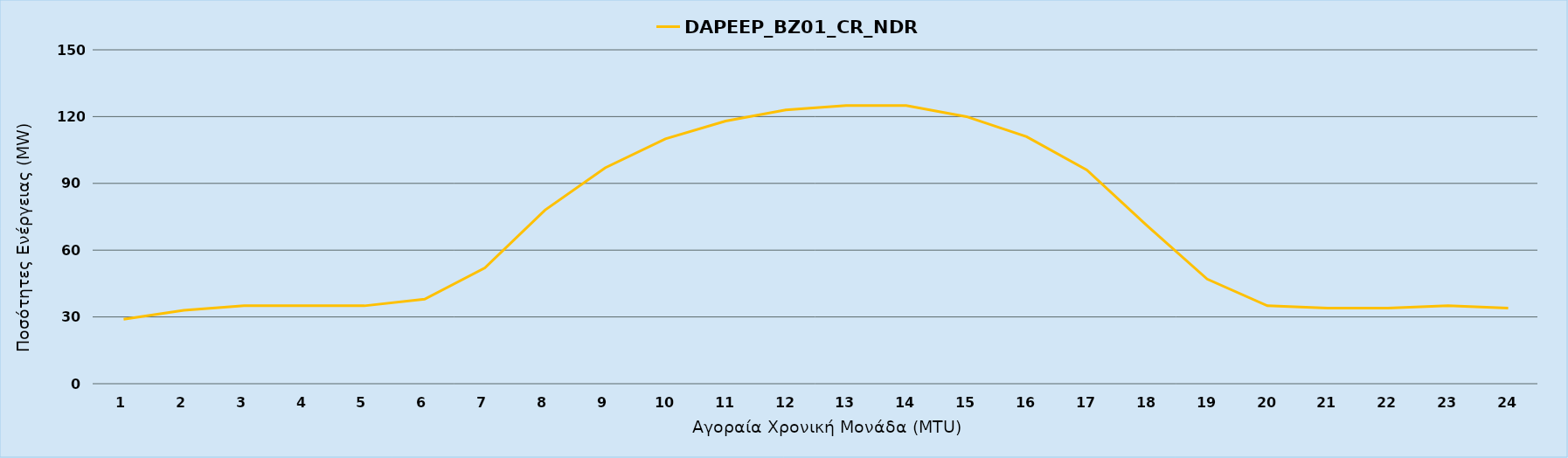
| Category | DAPEEP_BZ01_CR_NDR |
|---|---|
| 0 | 29 |
| 1 | 33 |
| 2 | 35 |
| 3 | 35 |
| 4 | 35 |
| 5 | 38 |
| 6 | 52 |
| 7 | 78 |
| 8 | 97 |
| 9 | 110 |
| 10 | 118 |
| 11 | 123 |
| 12 | 125 |
| 13 | 125 |
| 14 | 120 |
| 15 | 111 |
| 16 | 96 |
| 17 | 71 |
| 18 | 47 |
| 19 | 35 |
| 20 | 34 |
| 21 | 34 |
| 22 | 35 |
| 23 | 34 |